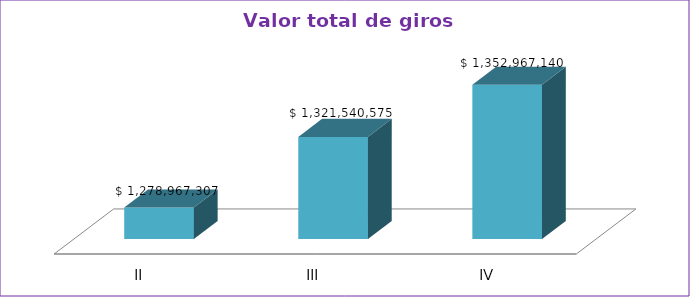
| Category | Series 0 |
|---|---|
| II | 1278967307 |
| III | 1321540575 |
| IV | 1352967140 |